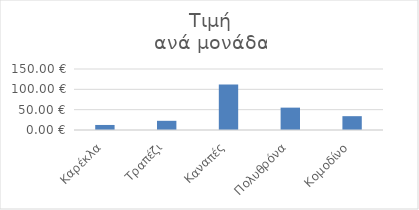
| Category | Τιμή
ανά μονάδα |
|---|---|
| Καρέκλα | 12.4 |
| Τραπέζι | 22.6 |
| Καναπές | 112 |
| Πολυθρόνα | 55 |
| Κομοδίνο | 34 |